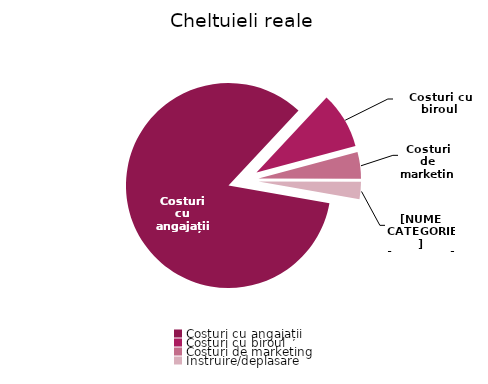
| Category | Series 0 |
|---|---|
| Costuri cu angajații | 659130 |
| Costuri cu biroul | 69350 |
| Costuri de marketing | 33159 |
| Instruire/deplasare | 21300 |